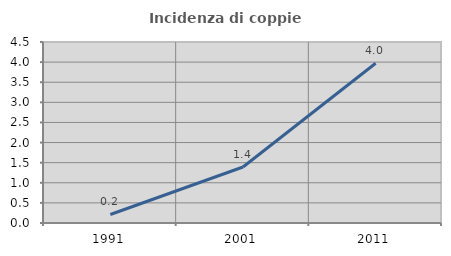
| Category | Incidenza di coppie miste |
|---|---|
| 1991.0 | 0.212 |
| 2001.0 | 1.392 |
| 2011.0 | 3.972 |